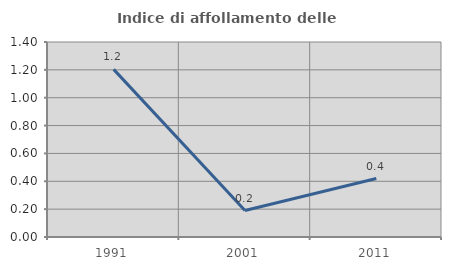
| Category | Indice di affollamento delle abitazioni  |
|---|---|
| 1991.0 | 1.204 |
| 2001.0 | 0.19 |
| 2011.0 | 0.42 |